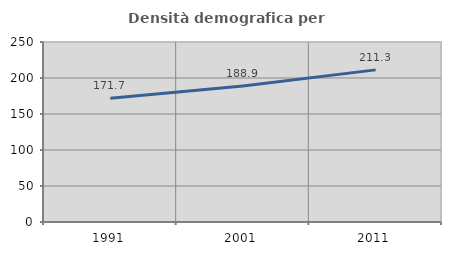
| Category | Densità demografica |
|---|---|
| 1991.0 | 171.739 |
| 2001.0 | 188.883 |
| 2011.0 | 211.279 |